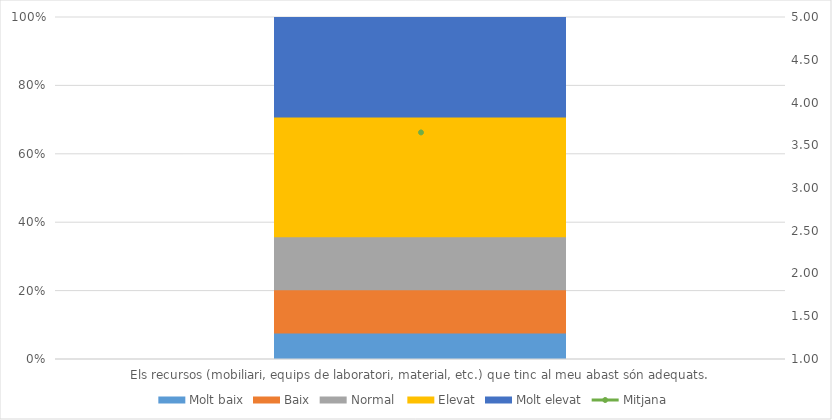
| Category | Molt baix | Baix | Normal  | Elevat | Molt elevat |
|---|---|---|---|---|---|
| Els recursos (mobiliari, equips de laboratori, material, etc.) que tinc al meu abast són adequats. | 8 | 13 | 16 | 36 | 30 |